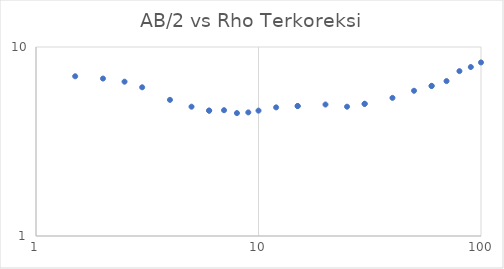
| Category | Series 0 |
|---|---|
| 1.5 | 7.001 |
| 2.0 | 6.809 |
| 2.5 | 6.554 |
| 3.0 | 6.122 |
| 4.0 | 5.252 |
| 5.0 | 4.832 |
| 6.0 | 4.606 |
| 6.0 | 4.606 |
| 7.0 | 4.63 |
| 8.0 | 4.471 |
| 9.0 | 4.507 |
| 10.0 | 4.606 |
| 12.0 | 4.793 |
| 15.0 | 4.871 |
| 15.0 | 4.871 |
| 20.0 | 4.962 |
| 25.0 | 4.832 |
| 30.0 | 5.004 |
| 30.0 | 5.004 |
| 40.0 | 5.381 |
| 50.0 | 5.867 |
| 60.0 | 6.223 |
| 60.0 | 6.223 |
| 70.0 | 6.601 |
| 80.0 | 7.453 |
| 90.0 | 7.835 |
| 100.0 | 8.285 |